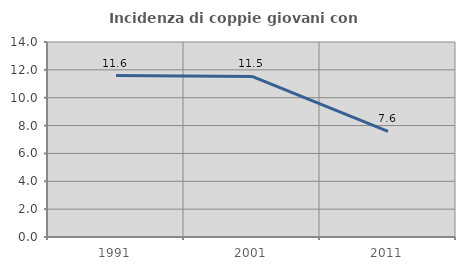
| Category | Incidenza di coppie giovani con figli |
|---|---|
| 1991.0 | 11.586 |
| 2001.0 | 11.526 |
| 2011.0 | 7.588 |